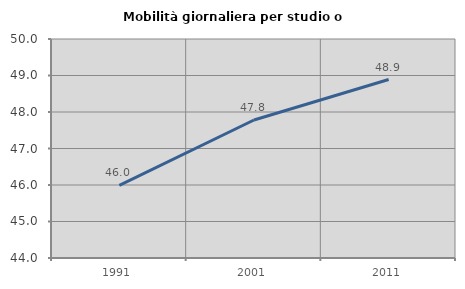
| Category | Mobilità giornaliera per studio o lavoro |
|---|---|
| 1991.0 | 45.989 |
| 2001.0 | 47.781 |
| 2011.0 | 48.889 |